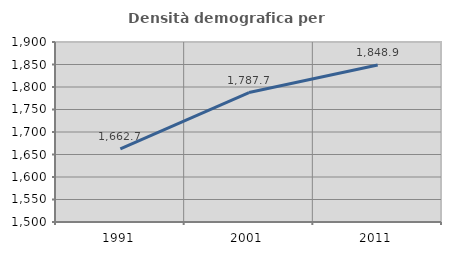
| Category | Densità demografica |
|---|---|
| 1991.0 | 1662.663 |
| 2001.0 | 1787.679 |
| 2011.0 | 1848.896 |